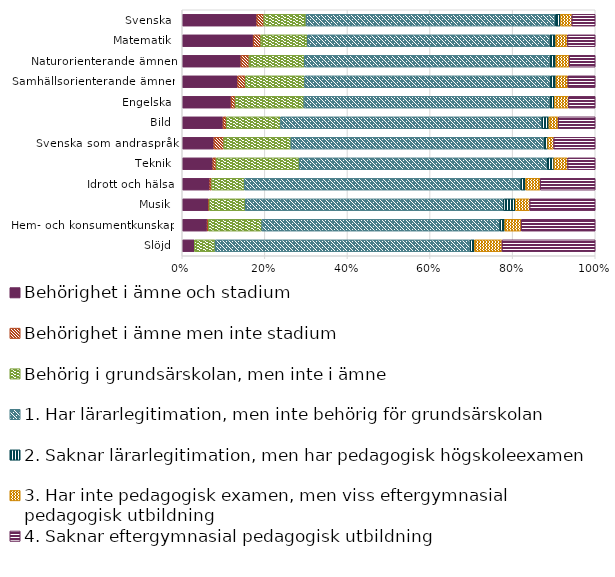
| Category | Behörighet i ämne och stadium | Behörighet i ämne men inte stadium | Behörig i grundsärskolan, men inte i ämne | 1. Har lärarlegitimation, men inte behörig för grundsärskolan | 2. Saknar lärarlegitimation, men har pedagogisk högskoleexamen | 3. Har inte pedagogisk examen, men viss eftergymnasial pedagogisk utbildning | 4. Saknar eftergymnasial pedagogisk utbildning |
|---|---|---|---|---|---|---|---|
| Slöjd | 0.029 | 0 | 0.05 | 0.618 | 0.011 | 0.067 | 0.226 |
| Hem- och konsumentkunskap | 0.06 | 0.003 | 0.129 | 0.576 | 0.012 | 0.04 | 0.179 |
| Musik | 0.063 | 0.002 | 0.087 | 0.625 | 0.029 | 0.035 | 0.159 |
| Idrott och hälsa | 0.067 | 0.004 | 0.079 | 0.67 | 0.011 | 0.035 | 0.133 |
| Teknik | 0.074 | 0.008 | 0.201 | 0.601 | 0.016 | 0.033 | 0.067 |
| Svenska som andraspråk | 0.077 | 0.024 | 0.163 | 0.612 | 0.01 | 0.014 | 0.1 |
| Bild | 0.099 | 0.008 | 0.131 | 0.633 | 0.017 | 0.022 | 0.09 |
| Engelska | 0.118 | 0.01 | 0.166 | 0.595 | 0.012 | 0.034 | 0.065 |
| Samhällsorienterande ämnen | 0.134 | 0.019 | 0.143 | 0.595 | 0.013 | 0.029 | 0.066 |
| Naturorienterande ämnen | 0.142 | 0.02 | 0.134 | 0.594 | 0.015 | 0.032 | 0.063 |
| Matematik | 0.172 | 0.018 | 0.113 | 0.587 | 0.015 | 0.029 | 0.067 |
| Svenska | 0.18 | 0.017 | 0.102 | 0.603 | 0.013 | 0.028 | 0.057 |